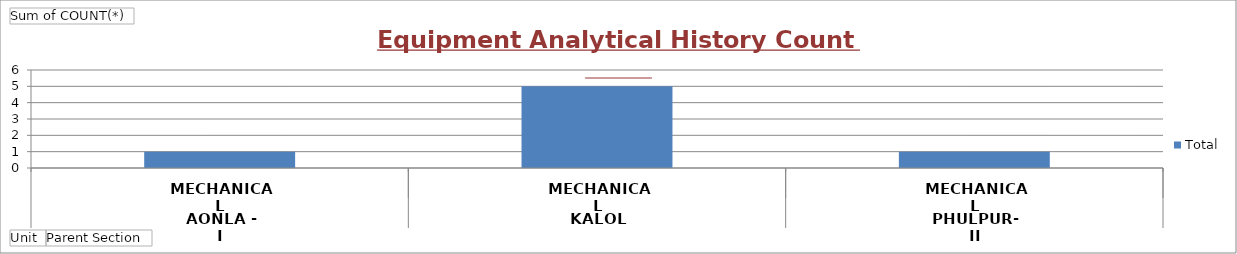
| Category | Total |
|---|---|
| 0 | 1 |
| 1 | 5 |
| 2 | 1 |